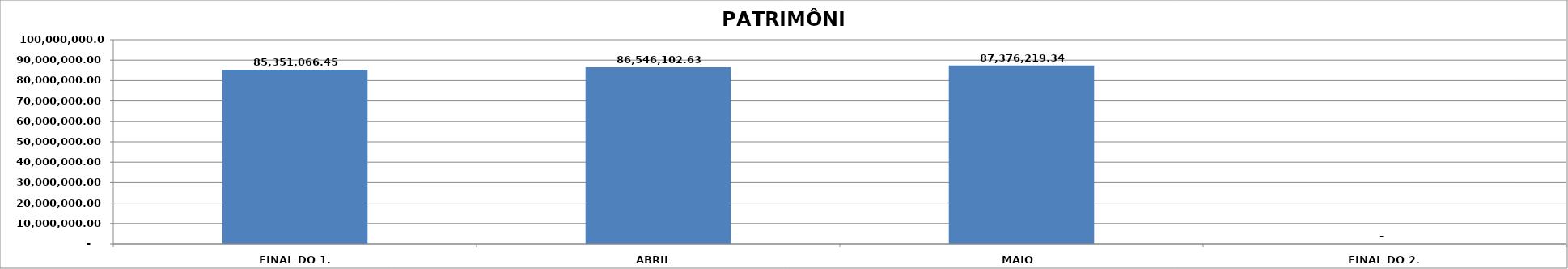
| Category | SALDO |
|---|---|
| FINAL DO 1. TRIMESTRE | 85351066.45 |
| ABRIL  | 86546102.63 |
| MAIO  | 87376219.34 |
| FINAL DO 2. TRIMESTRE | 0 |